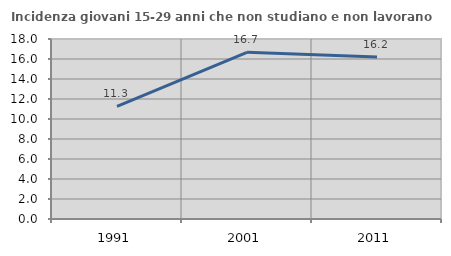
| Category | Incidenza giovani 15-29 anni che non studiano e non lavorano  |
|---|---|
| 1991.0 | 11.268 |
| 2001.0 | 16.667 |
| 2011.0 | 16.197 |